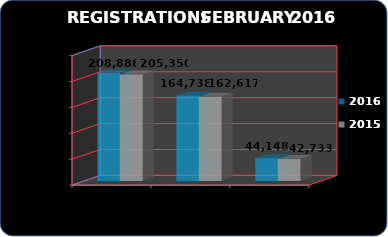
| Category | 2016 | 2015 |
|---|---|---|
| Total Registrations | 208886 | 205350 |
| No-Residentes | 164738 | 162617 |
| Residentes | 44148 | 42733 |